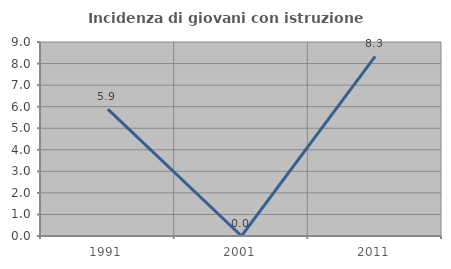
| Category | Incidenza di giovani con istruzione universitaria |
|---|---|
| 1991.0 | 5.882 |
| 2001.0 | 0 |
| 2011.0 | 8.333 |